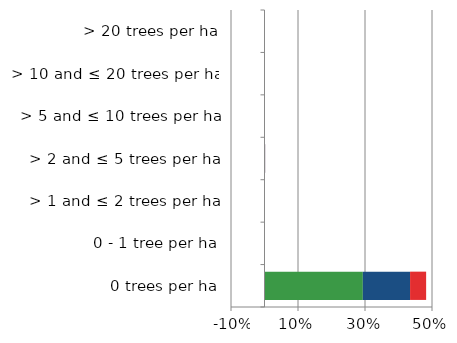
| Category | England | Scotland | Wales |
|---|---|---|---|
| 0 trees per ha | 0.294 | 0.141 | 0.048 |
| 0 - 1 tree per ha | 0 | 0 | 0 |
| > 1 and ≤ 2 trees per ha | 0 | 0.001 | 0 |
| > 2 and ≤ 5 trees per ha | 0.001 | 0.001 | 0 |
| > 5 and ≤ 10 trees per ha | 0.001 | 0 | 0 |
| > 10 and ≤ 20 trees per ha | 0 | 0 | 0 |
| > 20 trees per ha | 0 | 0 | 0 |